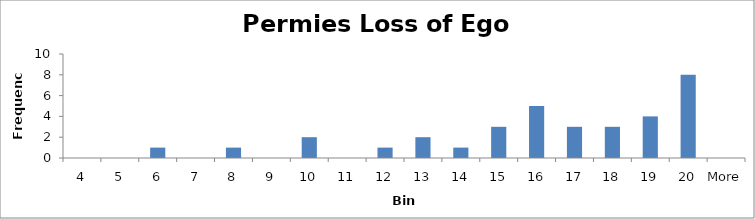
| Category | Frequency |
|---|---|
| 4 | 0 |
| 5 | 0 |
| 6 | 1 |
| 7 | 0 |
| 8 | 1 |
| 9 | 0 |
| 10 | 2 |
| 11 | 0 |
| 12 | 1 |
| 13 | 2 |
| 14 | 1 |
| 15 | 3 |
| 16 | 5 |
| 17 | 3 |
| 18 | 3 |
| 19 | 4 |
| 20 | 8 |
| More | 0 |